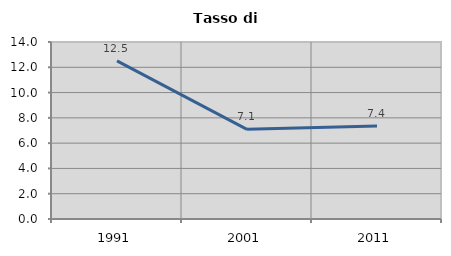
| Category | Tasso di disoccupazione   |
|---|---|
| 1991.0 | 12.505 |
| 2001.0 | 7.093 |
| 2011.0 | 7.365 |